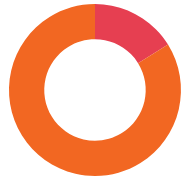
| Category | 3 570 000 Ft |
|---|---|
| FEDEZETLEN | 3570000 |
| FEDEZETT | 18550000 |